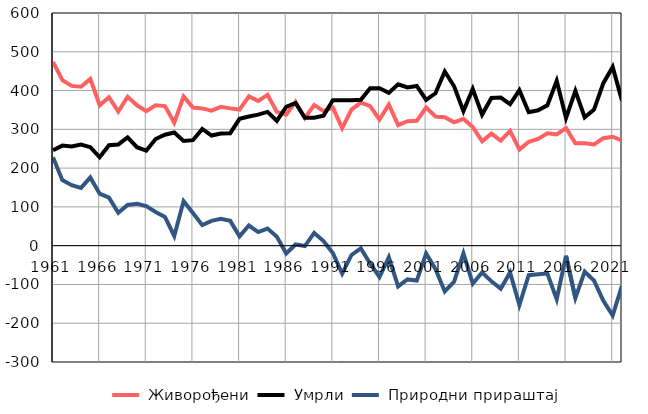
| Category |  Живорођени |  Умрли |  Природни прираштај |
|---|---|---|---|
| 1961.0 | 474 | 246 | 228 |
| 1962.0 | 427 | 258 | 169 |
| 1963.0 | 412 | 256 | 156 |
| 1964.0 | 410 | 261 | 149 |
| 1965.0 | 430 | 254 | 176 |
| 1966.0 | 362 | 228 | 134 |
| 1967.0 | 383 | 259 | 124 |
| 1968.0 | 346 | 261 | 85 |
| 1969.0 | 384 | 279 | 105 |
| 1970.0 | 362 | 254 | 108 |
| 1971.0 | 347 | 245 | 102 |
| 1972.0 | 362 | 275 | 87 |
| 1973.0 | 360 | 286 | 74 |
| 1974.0 | 317 | 292 | 25 |
| 1975.0 | 385 | 270 | 115 |
| 1976.0 | 356 | 272 | 84 |
| 1977.0 | 354 | 301 | 53 |
| 1978.0 | 348 | 284 | 64 |
| 1979.0 | 358 | 289 | 69 |
| 1980.0 | 354 | 290 | 64 |
| 1981.0 | 351 | 327 | 24 |
| 1982.0 | 385 | 333 | 52 |
| 1983.0 | 373 | 338 | 35 |
| 1984.0 | 389 | 345 | 44 |
| 1985.0 | 345 | 322 | 23 |
| 1986.0 | 338 | 358 | -20 |
| 1987.0 | 371 | 368 | 3 |
| 1988.0 | 329 | 330 | -1 |
| 1989.0 | 363 | 330 | 33 |
| 1990.0 | 347 | 335 | 12 |
| 1991.0 | 356 | 375 | -19 |
| 1992.0 | 303 | 375 | -72 |
| 1993.0 | 351 | 375 | -24 |
| 1994.0 | 369 | 376 | -7 |
| 1995.0 | 360 | 406 | -46 |
| 1996.0 | 325 | 406 | -81 |
| 1997.0 | 364 | 394 | -30 |
| 1998.0 | 311 | 416 | -105 |
| 1999.0 | 321 | 408 | -87 |
| 2000.0 | 322 | 412 | -90 |
| 2001.0 | 356 | 376 | -20 |
| 2002.0 | 333 | 393 | -60 |
| 2003.0 | 331 | 449 | -118 |
| 2004.0 | 318 | 411 | -93 |
| 2005.0 | 327 | 347 | -20 |
| 2006.0 | 306 | 404 | -98 |
| 2007.0 | 269 | 338 | -69 |
| 2008.0 | 289 | 381 | -92 |
| 2009.0 | 271 | 382 | -111 |
| 2010.0 | 296 | 365 | -69 |
| 2011.0 | 248 | 401 | -153 |
| 2012.0 | 268 | 344 | -76 |
| 2013.0 | 275 | 349 | -74 |
| 2014.0 | 290 | 362 | -72 |
| 2015.0 | 287 | 425 | -138 |
| 2016.0 | 303 | 329 | -26 |
| 2017.0 | 264 | 399 | -135 |
| 2018.0 | 264 | 331 | -67 |
| 2019.0 | 261 | 351 | -90 |
| 2020.0 | 277 | 419 | -142 |
| 2021.0 | 281 | 461 | -180 |
| 2022.0 | 271 | 374 | -103 |